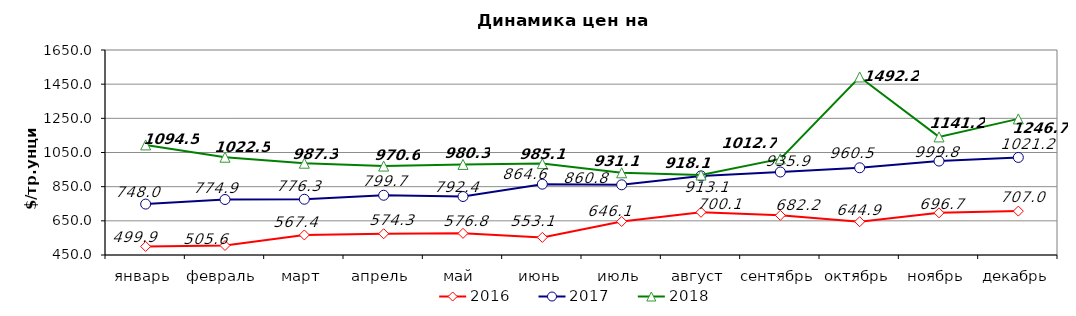
| Category | 2016 | 2017 | 2018 |
|---|---|---|---|
| январь | 499.9 | 748 | 1094.45 |
| февраль | 505.57 | 774.9 | 1022.45 |
| март | 567.38 | 776.3 | 987.33 |
| апрель | 574.33 | 799.67 | 970.55 |
| май | 576.75 | 792.43 | 980.3 |
| июнь | 553.09 | 864.64 | 985.05 |
| июль | 646.14 | 860.8 | 931.14 |
| август | 700.09 | 913.1 | 918.09 |
| сентябрь | 682.23 | 935.85 | 1012.65 |
| октябрь | 644.85 | 960.52 | 1492.18 |
| ноябрь | 696.68 | 999.8 | 1141.2 |
| декабрь | 706.98 | 1021.16 | 1246.72 |